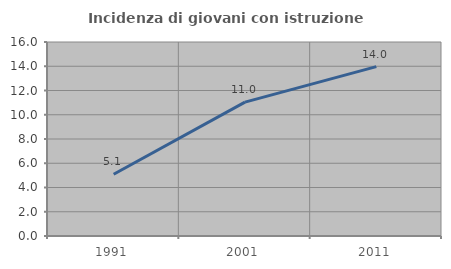
| Category | Incidenza di giovani con istruzione universitaria |
|---|---|
| 1991.0 | 5.096 |
| 2001.0 | 11.045 |
| 2011.0 | 13.968 |